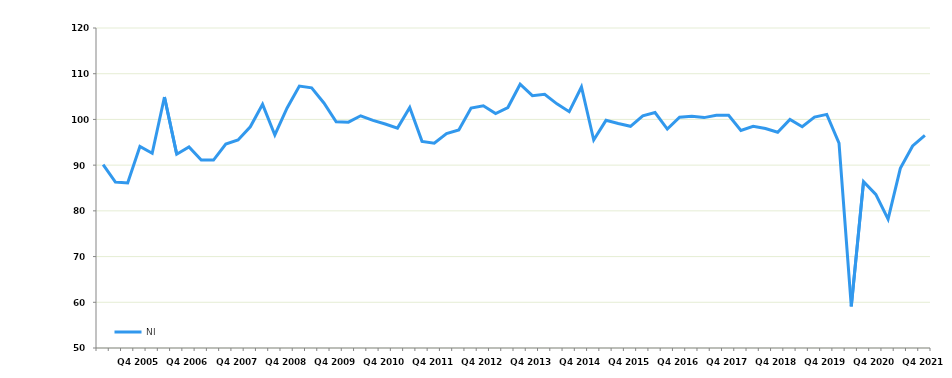
| Category | NI |
|---|---|
|  | 90.1 |
|  | 86.3 |
|  | 86.1 |
| Q4 2005 | 94.1 |
|  | 92.6 |
|  | 104.9 |
|  | 92.4 |
| Q4 2006 | 94 |
|  | 91.1 |
|  | 91.1 |
|  | 94.6 |
| Q4 2007 | 95.5 |
|  | 98.4 |
|  | 103.3 |
|  | 96.6 |
| Q4 2008 | 102.5 |
|  | 107.3 |
|  | 106.9 |
|  | 103.6 |
| Q4 2009 | 99.5 |
|  | 99.4 |
|  | 100.8 |
|  | 99.8 |
| Q4 2010 | 99 |
|  | 98.1 |
|  | 102.6 |
|  | 95.2 |
| Q4 2011 | 94.8 |
|  | 96.9 |
|  | 97.7 |
|  | 102.5 |
| Q4 2012 | 103 |
|  | 101.3 |
|  | 102.6 |
|  | 107.7 |
| Q4 2013 | 105.2 |
|  | 105.5 |
|  | 103.4 |
|  | 101.7 |
| Q4 2014 | 107.1 |
|  | 95.5 |
|  | 99.8 |
|  | 99.1 |
| Q4 2015 | 98.5 |
|  | 100.8 |
|  | 101.5 |
|  | 97.9 |
| Q4 2016 | 100.5 |
|  | 100.7 |
|  | 100.4 |
|  | 100.9 |
| Q4 2017 | 100.9 |
|  | 97.6 |
|  | 98.5 |
|  | 98 |
| Q4 2018 | 97.2 |
|  | 100 |
|  | 98.4 |
|  | 100.5 |
| Q4 2019 | 101.1 |
|  | 94.8 |
|  | 59.1 |
|  | 86.4 |
| Q4 2020 | 83.6 |
|  | 78.2 |
|  | 89.3 |
|  | 94.2 |
| Q4 2021 | 96.5 |